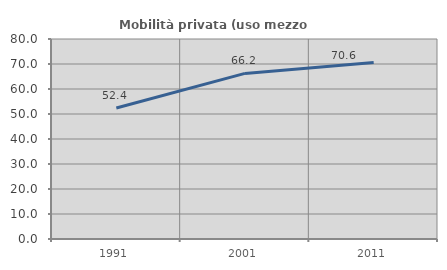
| Category | Mobilità privata (uso mezzo privato) |
|---|---|
| 1991.0 | 52.414 |
| 2001.0 | 66.245 |
| 2011.0 | 70.642 |